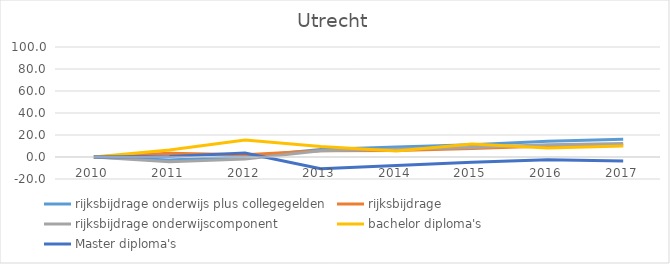
| Category | rijksbijdrage onderwijs plus collegegelden | rijksbijdrage  | rijksbijdrage onderwijscomponent | bachelor diploma's | Master diploma's |
|---|---|---|---|---|---|
| 2010.0 | 0 | 0 | 0 | 0 | 0 |
| 2011.0 | -2.642 | 3.505 | -4.219 | 6.421 | 0.471 |
| 2012.0 | 0.212 | 1.98 | -1.842 | 15.527 | 3.66 |
| 2013.0 | 6.85 | 5.58 | 5.57 | 9.596 | -10.574 |
| 2014.0 | 9.119 | 5.985 | 6.988 | 5.557 | -7.684 |
| 2015.0 | 11.124 | 7.82 | 8.55 | 11.814 | -4.73 |
| 2016.0 | 14.262 | 9.994 | 11.111 | 8.289 | -2.397 |
| 2017.0 | 16.205 | 10.924 | 12.336 | 10.086 | -3.532 |